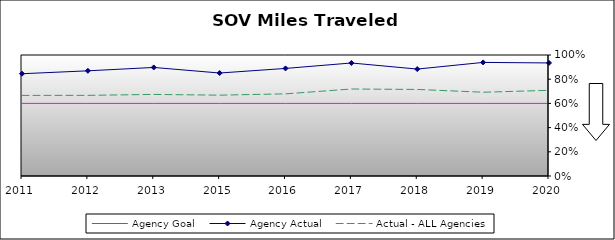
| Category | Agency Goal | Agency Actual | Actual - ALL Agencies |
|---|---|---|---|
| 2011.0 | 0.6 | 0.845 | 0.666 |
| 2012.0 | 0.6 | 0.869 | 0.666 |
| 2013.0 | 0.6 | 0.897 | 0.674 |
| 2015.0 | 0.6 | 0.851 | 0.668 |
| 2016.0 | 0.6 | 0.889 | 0.679 |
| 2017.0 | 0.6 | 0.934 | 0.719 |
| 2018.0 | 0.6 | 0.884 | 0.715 |
| 2019.0 | 0.6 | 0.939 | 0.692 |
| 2020.0 | 0.6 | 0.934 | 0.708 |